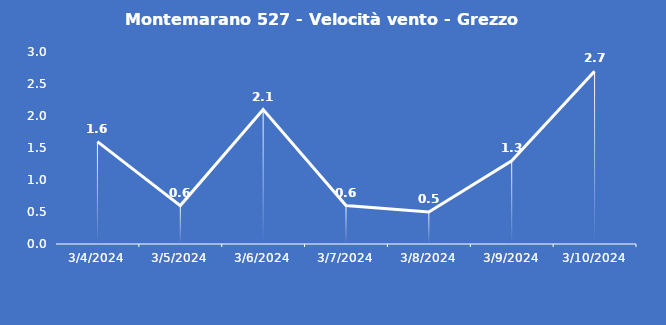
| Category | Montemarano 527 - Velocità vento - Grezzo (m/s) |
|---|---|
| 3/4/24 | 1.6 |
| 3/5/24 | 0.6 |
| 3/6/24 | 2.1 |
| 3/7/24 | 0.6 |
| 3/8/24 | 0.5 |
| 3/9/24 | 1.3 |
| 3/10/24 | 2.7 |